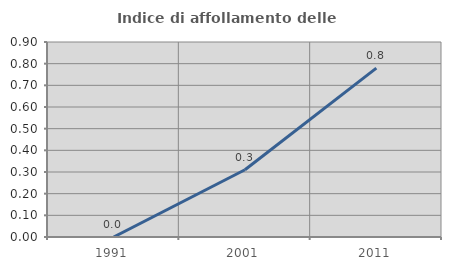
| Category | Indice di affollamento delle abitazioni  |
|---|---|
| 1991.0 | 0 |
| 2001.0 | 0.311 |
| 2011.0 | 0.779 |